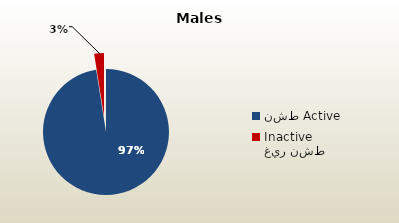
| Category | الذكور غير القطريين  Non-Qatari Males |
|---|---|
| نشط Active | 1706660 |
| غير نشط Inactive | 43857 |